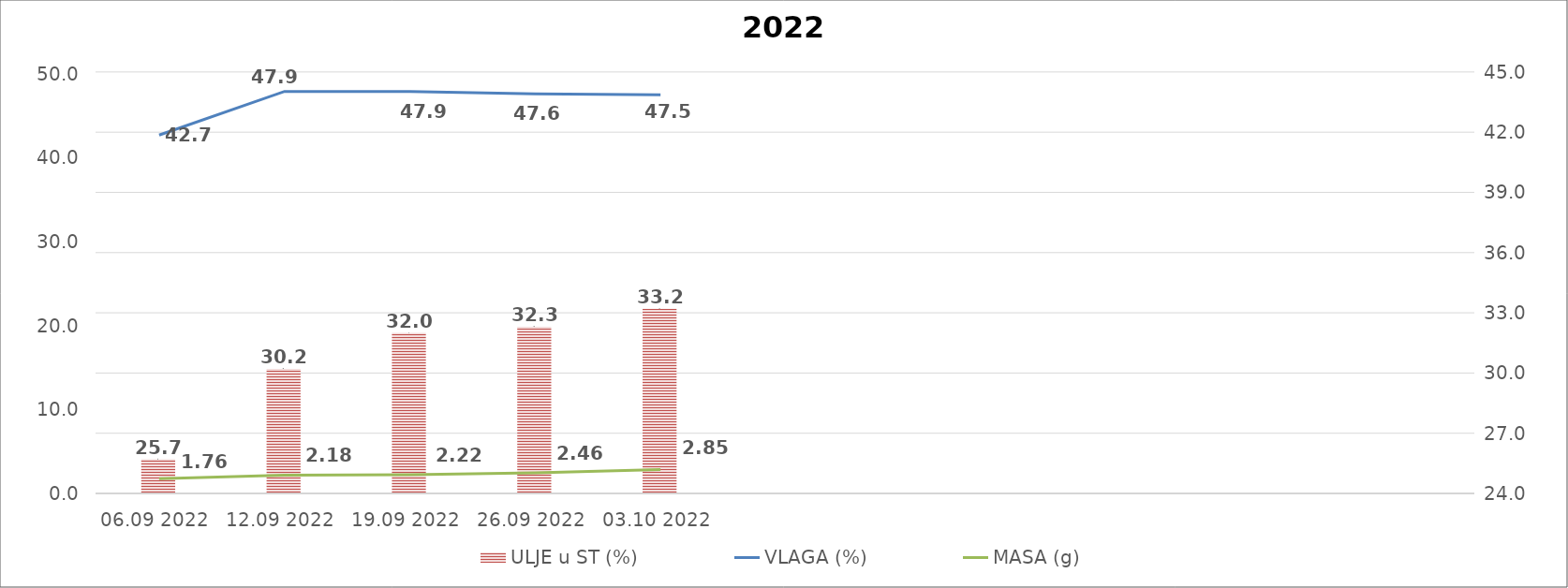
| Category | ULJE u ST (%) |
|---|---|
| 06.09 2022 | 25.7 |
| 12.09 2022 | 30.2 |
| 19.09 2022 | 32 |
| 26.09 2022 | 32.3 |
| 03.10 2022 | 33.2 |